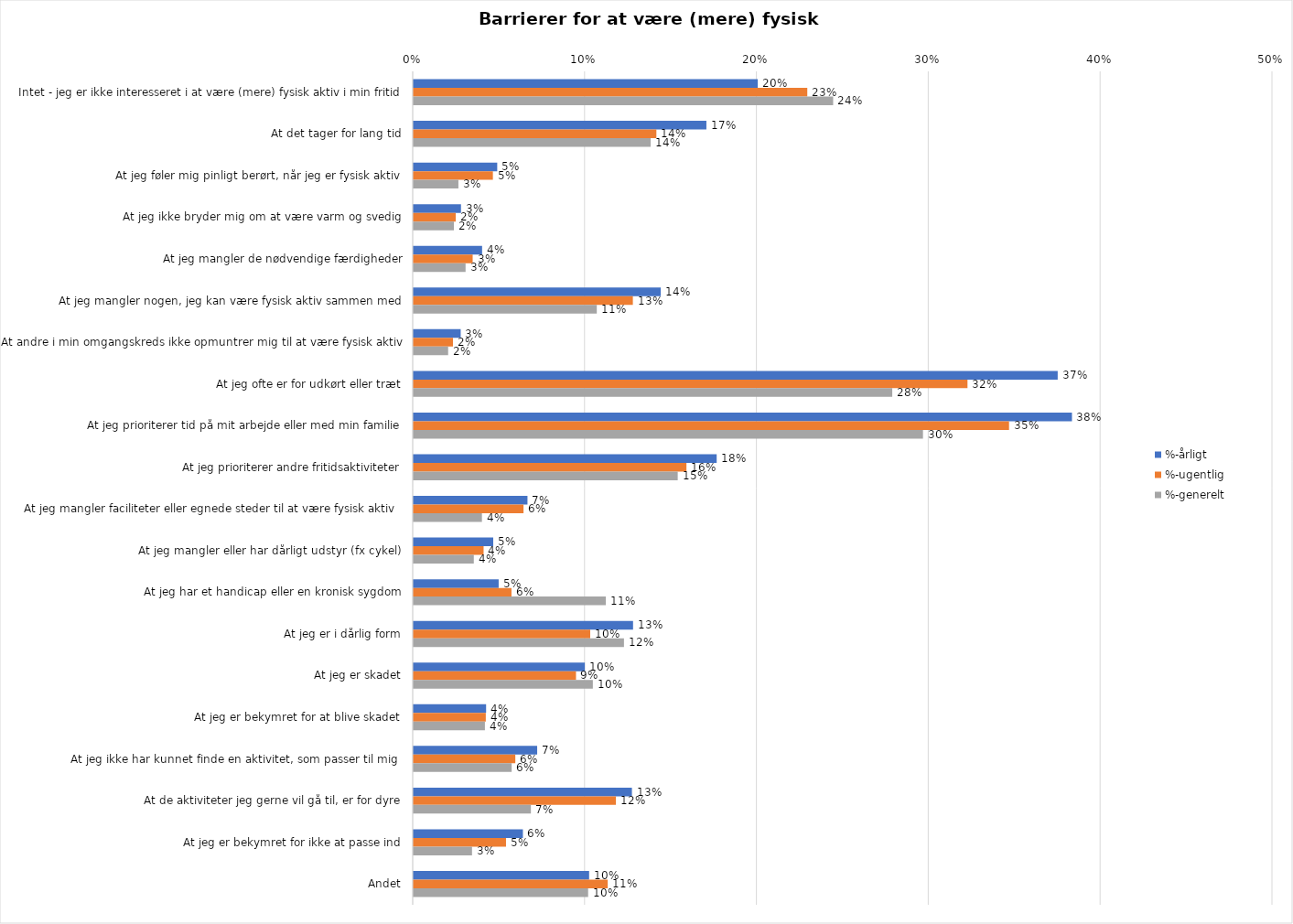
| Category | %-årligt | %-ugentlig | %-generelt |
|---|---|---|---|
| Intet - jeg er ikke interesseret i at være (mere) fysisk aktiv i min fritid | 0.2 | 0.229 | 0.244 |
| At det tager for lang tid | 0.17 | 0.141 | 0.138 |
| At jeg føler mig pinligt berørt, når jeg er fysisk aktiv | 0.049 | 0.046 | 0.026 |
| At jeg ikke bryder mig om at være varm og svedig | 0.028 | 0.024 | 0.023 |
| At jeg mangler de nødvendige færdigheder | 0.04 | 0.034 | 0.03 |
| At jeg mangler nogen, jeg kan være fysisk aktiv sammen med | 0.144 | 0.128 | 0.107 |
| At andre i min omgangskreds ikke opmuntrer mig til at være fysisk aktiv | 0.027 | 0.023 | 0.02 |
| At jeg ofte er for udkørt eller træt | 0.375 | 0.322 | 0.279 |
| At jeg prioriterer tid på mit arbejde eller med min familie | 0.383 | 0.346 | 0.296 |
| At jeg prioriterer andre fritidsaktiviteter | 0.176 | 0.159 | 0.154 |
| At jeg mangler faciliteter eller egnede steder til at være fysisk aktiv  | 0.066 | 0.064 | 0.04 |
| At jeg mangler eller har dårligt udstyr (fx cykel) | 0.046 | 0.041 | 0.035 |
| At jeg har et handicap eller en kronisk sygdom | 0.049 | 0.057 | 0.112 |
| At jeg er i dårlig form | 0.128 | 0.103 | 0.122 |
| At jeg er skadet | 0.1 | 0.094 | 0.104 |
| At jeg er bekymret for at blive skadet | 0.042 | 0.042 | 0.041 |
| At jeg ikke har kunnet finde en aktivitet, som passer til mig  | 0.072 | 0.059 | 0.057 |
| At de aktiviteter jeg gerne vil gå til, er for dyre | 0.127 | 0.118 | 0.068 |
| At jeg er bekymret for ikke at passe ind | 0.064 | 0.054 | 0.034 |
| Andet | 0.102 | 0.113 | 0.102 |